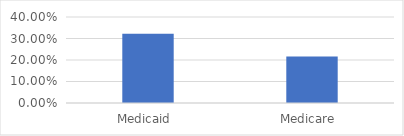
| Category | Series 0 |
|---|---|
| Medicaid  | 0.322 |
| Medicare  | 0.216 |